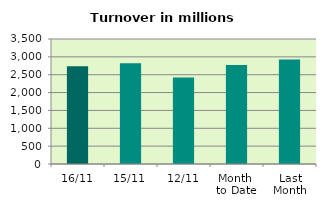
| Category | Series 0 |
|---|---|
| 16/11 | 2735.657 |
| 15/11 | 2818.574 |
| 12/11 | 2424.83 |
| Month 
to Date | 2769.987 |
| Last
Month | 2924.951 |